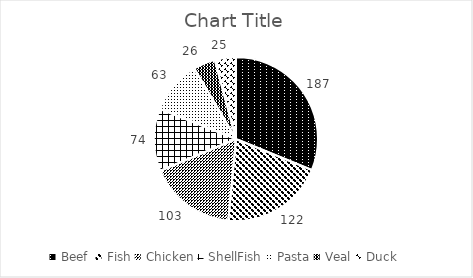
| Category | Series 0 |
|---|---|
| Beef  | 187 |
| Fish | 122 |
| Chicken | 103 |
| ShellFish | 74 |
| Pasta | 63 |
| Veal | 26 |
| Duck | 25 |